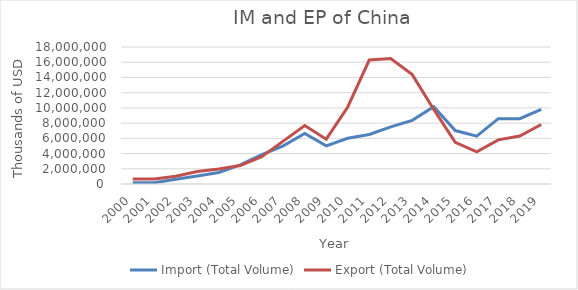
| Category | Import (Total Volume) | Export (Total Volume) |
|---|---|---|
| 2000.0 | 150919.4 | 672548.6 |
| 2001.0 | 171983.9 | 646650.7 |
| 2002.0 | 626438 | 1018079 |
| 2003.0 | 1047292.6 | 1653081 |
| 2004.0 | 1516283.29 | 1966911.13 |
| 2005.0 | 2503661.23 | 2422506.65 |
| 2006.0 | 3849861.56 | 3592514.16 |
| 2007.0 | 5008014.3 | 5635914.31 |
| 2008.0 | 6630501 | 7676608.96 |
| 2009.0 | 5019021 | 5888592.5 |
| 2010.0 | 6001315 | 10122070.04 |
| 2011.0 | 6507124.5 | 16291513.41 |
| 2012.0 | 7497716.2 | 16484409 |
| 2013.0 | 8364465.53 | 14373748.04 |
| 2014.0 | 10156188.3 | 9799418.42 |
| 2015.0 | 7020145.4 | 5480137.49 |
| 2016.0 | 6278130.4 | 4214925.9 |
| 2017.0 | 8583169.4 | 5797975.62 |
| 2018.0 | 8583169.4 | 6307476.19 |
| 2019.0 | 9801477 | 7823406.35 |